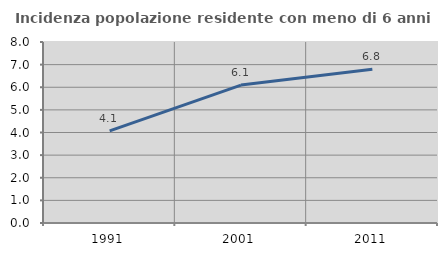
| Category | Incidenza popolazione residente con meno di 6 anni |
|---|---|
| 1991.0 | 4.069 |
| 2001.0 | 6.096 |
| 2011.0 | 6.8 |